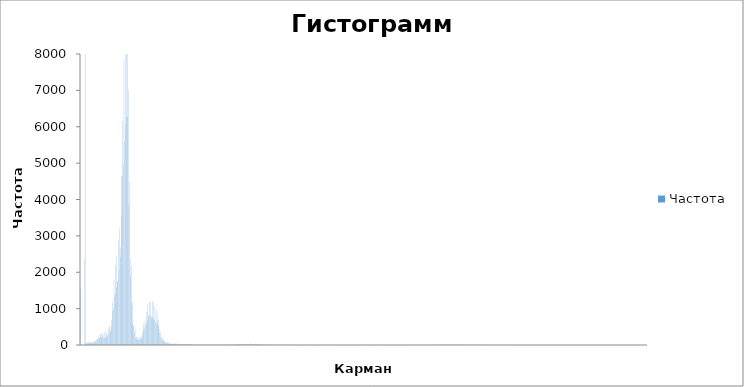
| Category | Частота |
|---|---|
| -1 | 1540 |
| -0,868263672 | 0 |
| -0,736527344 | 0 |
| -0,604791016 | 0 |
| -0,473054688 | 0 |
| -0,341318359 | 0 |
| -0,209582031 | 0 |
| -0,077845703 | 0 |
| 0,053890625 | 2382 |
| 0,185626953 | 45 |
| 0,317363281 | 24835 |
| 0,449099609 | 44 |
| 0,580835938 | 53 |
| 0,712572266 | 77 |
| 0,844308594 | 64 |
| 0,976044922 | 103 |
| 1,10778125 | 57 |
| 1,239517578 | 47 |
| 1,371253906 | 85 |
| 1,502990234 | 54 |
| 1,634726563 | 88 |
| 1,766462891 | 56 |
| 1,898199219 | 61 |
| 2,029935547 | 97 |
| 2,161671875 | 79 |
| 2,293408203 | 107 |
| 2,425144531 | 67 |
| 2,556880859 | 75 |
| 2,688617188 | 127 |
| 2,820353516 | 78 |
| 2,952089844 | 166 |
| 3,083826172 | 184 |
| 3,2155625 | 152 |
| 3,347298828 | 258 |
| 3,479035156 | 197 |
| 3,610771484 | 206 |
| 3,742507813 | 306 |
| 3,874244141 | 219 |
| 4,005980469 | 316 |
| 4,137716797 | 179 |
| 4,269453125 | 238 |
| 4,401189453 | 310 |
| 4,532925781 | 207 |
| 4,664662109 | 364 |
| 4,796398438 | 195 |
| 4,928134766 | 175 |
| 5,059871094 | 317 |
| 5,191607422 | 215 |
| 5,32334375 | 345 |
| 5,455080078 | 252 |
| 5,586816406 | 287 |
| 5,718552734 | 485 |
| 5,850289063 | 322 |
| 5,982025391 | 539 |
| 6,113761719 | 422 |
| 6,245498047 | 388 |
| 6,377234375 | 688 |
| 6,508970703 | 501 |
| 6,640707031 | 938 |
| 6,772443359 | 1184 |
| 6,904179688 | 1023 |
| 7,035916016 | 1782 |
| 7,167652344 | 1326 |
| 7,299388672 | 1412 |
| 7,431125 | 2191 |
| 7,562861328 | 1576 |
| 7,694597656 | 2431 |
| 7,826333984 | 1743 |
| 7,958070313 | 1744 |
| 8,089806641 | 2883 |
| 8,221542969 | 2039 |
| 8,353279297 | 3217 |
| 8,485015625 | 2420 |
| 8,616751953 | 2684 |
| 8,748488281 | 4652 |
| 8,880224609 | 3576 |
| 9,011960938 | 6165 |
| 9,143697266 | 4659 |
| 9,275433594 | 4966 |
| 9,407169922 | 7833 |
| 9,53890625 | 5611 |
| 9,670642578 | 8711 |
| 9,802378906 | 6092 |
| 9,934115234 | 6269 |
| 10,06585156 | 9246 |
| 10,19758789 | 6278 |
| 10,32932422 | 8709 |
| 10,46106055 | 7017 |
| 10,59279688 | 3856 |
| 10,7245332 | 4497 |
| 10,85626953 | 2375 |
| 10,98800586 | 1891 |
| 11,11974219 | 2172 |
| 11,25147852 | 1094 |
| 11,38321484 | 1196 |
| 11,51495117 | 611 |
| 11,6466875 | 495 |
| 11,77842383 | 557 |
| 11,91016016 | 339 |
| 12,04189648 | 416 |
| 12,17363281 | 204 |
| 12,30536914 | 152 |
| 12,43710547 | 240 |
| 12,5688418 | 148 |
| 12,70057813 | 223 |
| 12,83231445 | 149 |
| 12,96405078 | 149 |
| 13,09578711 | 218 |
| 13,22752344 | 176 |
| 13,35925977 | 237 |
| 13,49099609 | 162 |
| 13,62273242 | 206 |
| 13,75446875 | 354 |
| 13,88620508 | 270 |
| 14,01794141 | 409 |
| 14,14967773 | 600 |
| 14,28141406 | 457 |
| 14,41315039 | 700 |
| 14,54488672 | 540 |
| 14,67662305 | 595 |
| 14,80835938 | 929 |
| 14,9400957 | 674 |
| 15,07183203 | 1130 |
| 15,20356836 | 834 |
| 15,33530469 | 783 |
| 15,46704102 | 1176 |
| 15,59877734 | 805 |
| 15,73051367 | 1181 |
| 15,86225 | 751 |
| 15,99398633 | 806 |
| 16,12572266 | 1198 |
| 16,25745898 | 764 |
| 16,38919531 | 1192 |
| 16,52093164 | 705 |
| 16,65266797 | 694 |
| 16,7844043 | 1053 |
| 16,91614063 | 623 |
| 17,04787695 | 954 |
| 17,17961328 | 593 |
| 17,31134961 | 603 |
| 17,44308594 | 872 |
| 17,57482227 | 522 |
| 17,70655859 | 685 |
| 17,83829492 | 333 |
| 17,97003125 | 446 |
| 18,10176758 | 346 |
| 18,23350391 | 197 |
| 18,36524023 | 174 |
| 18,49697656 | 219 |
| 18,62871289 | 108 |
| 18,76044922 | 156 |
| 18,89218555 | 102 |
| 19,02392188 | 83 |
| 19,1556582 | 124 |
| 19,28739453 | 67 |
| 19,41913086 | 97 |
| 19,55086719 | 60 |
| 19,68260352 | 53 |
| 19,81433984 | 68 |
| 19,94607617 | 36 |
| 20,0778125 | 60 |
| 20,20954883 | 39 |
| 20,34128516 | 32 |
| 20,47302148 | 31 |
| 20,60475781 | 35 |
| 20,73649414 | 56 |
| 20,86823047 | 37 |
| 20,9999668 | 20 |
| 21,13170313 | 29 |
| 21,26343945 | 24 |
| 21,39517578 | 31 |
| 21,52691211 | 21 |
| 21,65864844 | 38 |
| 21,79038477 | 52 |
| 21,92212109 | 13 |
| 22,05385742 | 22 |
| 22,18559375 | 34 |
| 22,31733008 | 21 |
| 22,44906641 | 34 |
| 22,58080273 | 18 |
| 22,71253906 | 13 |
| 22,84427539 | 21 |
| 22,97601172 | 17 |
| 23,10774805 | 33 |
| 23,23948438 | 20 |
| 23,3712207 | 26 |
| 23,50295703 | 25 |
| 23,63469336 | 17 |
| 23,76642969 | 27 |
| 23,89816602 | 19 |
| 24,02990234 | 17 |
| 24,16163867 | 34 |
| 24,293375 | 22 |
| 24,42511133 | 34 |
| 24,55684766 | 13 |
| 24,68858398 | 22 |
| 24,82032031 | 28 |
| 24,95205664 | 21 |
| 25,08379297 | 30 |
| 25,2155293 | 22 |
| 25,34726563 | 29 |
| 25,47900195 | 20 |
| 25,61073828 | 11 |
| 25,74247461 | 10 |
| 25,87421094 | 13 |
| 26,00594727 | 17 |
| 26,13768359 | 14 |
| 26,26941992 | 10 |
| 26,40115625 | 6 |
| 26,53289258 | 16 |
| 26,66462891 | 11 |
| 26,79636523 | 11 |
| 26,92810156 | 3 |
| 27,05983789 | 10 |
| 27,19157422 | 7 |
| 27,32331055 | 8 |
| 27,45504688 | 17 |
| 27,5867832 | 6 |
| 27,71851953 | 8 |
| 27,85025586 | 15 |
| 27,98199219 | 16 |
| 28,11372852 | 8 |
| 28,24546484 | 3 |
| 28,37720117 | 7 |
| 28,5089375 | 14 |
| 28,64067383 | 7 |
| 28,77241016 | 5 |
| 28,90414648 | 5 |
| 29,03588281 | 7 |
| 29,16761914 | 6 |
| 29,29935547 | 12 |
| 29,4310918 | 6 |
| 29,56282813 | 9 |
| 29,69456445 | 6 |
| 29,82630078 | 17 |
| 29,95803711 | 7 |
| 30,08977344 | 13 |
| 30,22150977 | 12 |
| 30,35324609 | 14 |
| 30,48498242 | 14 |
| 30,61671875 | 10 |
| 30,74845508 | 5 |
| 30,88019141 | 10 |
| 31,01192773 | 7 |
| 31,14366406 | 12 |
| 31,27540039 | 4 |
| 31,40713672 | 4 |
| 31,53887305 | 17 |
| 31,67060938 | 9 |
| 31,8023457 | 13 |
| 31,93408203 | 13 |
| 32,06581836 | 5 |
| 32,19755469 | 9 |
| 32,32929102 | 6 |
| 32,46102734 | 14 |
| 32,59276367 | 7 |
| 32,7245 | 5 |
| 32,85623633 | 20 |
| 32,98797266 | 12 |
| 33,11970898 | 9 |
| 33,25144531 | 14 |
| 33,38318164 | 8 |
| 33,51491797 | 10 |
| 33,6466543 | 11 |
| 33,77839063 | 7 |
| 33,91012695 | 17 |
| 34,04186328 | 7 |
| 34,17359961 | 14 |
| 34,30533594 | 5 |
| 34,43707227 | 12 |
| 34,56880859 | 16 |
| 34,70054492 | 12 |
| 34,83228125 | 17 |
| 34,96401758 | 16 |
| 35,09575391 | 11 |
| 35,22749023 | 6 |
| 35,35922656 | 10 |
| 35,49096289 | 24 |
| 35,62269922 | 12 |
| 35,75443555 | 12 |
| 35,88617188 | 32 |
| 36,0179082 | 12 |
| 36,14964453 | 24 |
| 36,28138086 | 21 |
| 36,41311719 | 28 |
| 36,54485352 | 27 |
| 36,67658984 | 31 |
| 36,80832617 | 21 |
| 36,9400625 | 28 |
| 37,07179883 | 17 |
| 37,20353516 | 24 |
| 37,33527148 | 23 |
| 37,46700781 | 32 |
| 37,59874414 | 35 |
| 37,73048047 | 27 |
| 37,8622168 | 29 |
| 37,99395313 | 20 |
| 38,12568945 | 17 |
| 38,25742578 | 31 |
| 38,38916211 | 12 |
| 38,52089844 | 26 |
| 38,65263477 | 22 |
| 38,78437109 | 12 |
| 38,91610742 | 40 |
| 39,04784375 | 19 |
| 39,17958008 | 25 |
| 39,31131641 | 28 |
| 39,44305273 | 21 |
| 39,57478906 | 46 |
| 39,70652539 | 19 |
| 39,83826172 | 21 |
| 39,96999805 | 26 |
| 40,10173438 | 7 |
| 40,2334707 | 29 |
| 40,36520703 | 27 |
| 40,49694336 | 18 |
| 40,62867969 | 41 |
| 40,76041602 | 9 |
| 40,89215234 | 25 |
| 41,02388867 | 11 |
| 41,155625 | 23 |
| 41,28736133 | 26 |
| 41,41909766 | 16 |
| 41,55083398 | 27 |
| 41,68257031 | 21 |
| 41,81430664 | 16 |
| 41,94604297 | 24 |
| 42,0777793 | 13 |
| 42,20951563 | 24 |
| 42,34125195 | 14 |
| 42,47298828 | 11 |
| 42,60472461 | 19 |
| 42,73646094 | 8 |
| 42,86819727 | 14 |
| 42,99993359 | 7 |
| 43,13166992 | 17 |
| 43,26340625 | 2 |
| 43,39514258 | 6 |
| 43,52687891 | 4 |
| 43,65861523 | 10 |
| 43,79035156 | 3 |
| 43,92208789 | 13 |
| 44,05382422 | 7 |
| 44,18556055 | 9 |
| 44,31729688 | 5 |
| 44,4490332 | 5 |
| 44,58076953 | 10 |
| 44,71250586 | 5 |
| 44,84424219 | 6 |
| 44,97597852 | 17 |
| 45,10771484 | 6 |
| 45,23945117 | 6 |
| 45,3711875 | 7 |
| 45,50292383 | 2 |
| 45,63466016 | 4 |
| 45,76639648 | 0 |
| 45,89813281 | 3 |
| 46,02986914 | 4 |
| 46,16160547 | 5 |
| 46,2933418 | 1 |
| 46,42507813 | 5 |
| 46,55681445 | 1 |
| 46,68855078 | 9 |
| 46,82028711 | 3 |
| 46,95202344 | 5 |
| 47,08375977 | 2 |
| 47,21549609 | 6 |
| 47,34723242 | 10 |
| 47,47896875 | 4 |
| 47,61070508 | 8 |
| 47,74244141 | 9 |
| 47,87417773 | 6 |
| 48,00591406 | 5 |
| 48,13765039 | 5 |
| 48,26938672 | 5 |
| 48,40112305 | 2 |
| 48,53285938 | 1 |
| 48,6645957 | 1 |
| 48,79633203 | 6 |
| 48,92806836 | 8 |
| 49,05980469 | 3 |
| 49,19154102 | 3 |
| 49,32327734 | 4 |
| 49,45501367 | 4 |
| 49,58675 | 1 |
| 49,71848633 | 2 |
| 49,85022266 | 0 |
| 49,98195898 | 2 |
| 50,11369531 | 0 |
| 50,24543164 | 1 |
| 50,37716797 | 1 |
| 50,5089043 | 0 |
| 50,64064063 | 3 |
| 50,77237695 | 1 |
| 50,90411328 | 2 |
| 51,03584961 | 2 |
| 51,16758594 | 3 |
| 51,29932227 | 1 |
| 51,43105859 | 3 |
| 51,56279492 | 1 |
| 51,69453125 | 1 |
| 51,82626758 | 1 |
| 51,95800391 | 2 |
| 52,08974023 | 2 |
| 52,22147656 | 0 |
| 52,35321289 | 6 |
| 52,48494922 | 2 |
| 52,61668555 | 3 |
| 52,74842188 | 0 |
| 52,8801582 | 0 |
| 53,01189453 | 2 |
| 53,14363086 | 0 |
| 53,27536719 | 1 |
| 53,40710352 | 3 |
| 53,53883984 | 1 |
| 53,67057617 | 5 |
| 53,8023125 | 1 |
| 53,93404883 | 5 |
| 54,06578516 | 1 |
| 54,19752148 | 1 |
| 54,32925781 | 1 |
| 54,46099414 | 1 |
| 54,59273047 | 0 |
| 54,7244668 | 0 |
| 54,85620313 | 3 |
| 54,98793945 | 5 |
| 55,11967578 | 1 |
| 55,25141211 | 1 |
| 55,38314844 | 1 |
| 55,51488477 | 1 |
| 55,64662109 | 1 |
| 55,77835742 | 0 |
| 55,91009375 | 1 |
| 56,04183008 | 3 |
| 56,17356641 | 1 |
| 56,30530273 | 0 |
| 56,43703906 | 3 |
| 56,56877539 | 4 |
| 56,70051172 | 4 |
| 56,83224805 | 1 |
| 56,96398438 | 1 |
| 57,0957207 | 2 |
| 57,22745703 | 2 |
| 57,35919336 | 1 |
| 57,49092969 | 1 |
| 57,62266602 | 1 |
| 57,75440234 | 1 |
| 57,88613867 | 3 |
| 58,017875 | 5 |
| 58,14961133 | 1 |
| 58,28134766 | 2 |
| 58,41308398 | 2 |
| 58,54482031 | 1 |
| 58,67655664 | 2 |
| 58,80829297 | 0 |
| 58,9400293 | 5 |
| 59,07176563 | 1 |
| 59,20350195 | 0 |
| 59,33523828 | 1 |
| 59,46697461 | 2 |
| 59,59871094 | 0 |
| 59,73044727 | 0 |
| 59,86218359 | 0 |
| 59,99391992 | 0 |
| 60,12565625 | 1 |
| 60,25739258 | 1 |
| 60,38912891 | 3 |
| 60,52086523 | 1 |
| 60,65260156 | 0 |
| 60,78433789 | 0 |
| 60,91607422 | 0 |
| 61,04781055 | 1 |
| 61,17954688 | 3 |
| 61,3112832 | 0 |
| 61,44301953 | 0 |
| 61,57475586 | 0 |
| 61,70649219 | 3 |
| 61,83822852 | 0 |
| 61,96996484 | 1 |
| 62,10170117 | 0 |
| 62,2334375 | 1 |
| 62,36517383 | 1 |
| 62,49691016 | 0 |
| 62,62864648 | 1 |
| 62,76038281 | 0 |
| 62,89211914 | 4 |
| 63,02385547 | 3 |
| 63,1555918 | 2 |
| 63,28732813 | 3 |
| 63,41906445 | 1 |
| 63,55080078 | 2 |
| 63,68253711 | 1 |
| 63,81427344 | 0 |
| 63,94600977 | 0 |
| 64,07774609 | 0 |
| 64,20948242 | 1 |
| 64,34121875 | 1 |
| 64,47295508 | 0 |
| 64,60469141 | 1 |
| 64,73642773 | 0 |
| 64,86816406 | 0 |
| 64,99990039 | 3 |
| 65,13163672 | 1 |
| 65,26337305 | 1 |
| 65,39510938 | 0 |
| 65,5268457 | 0 |
| 65,65858203 | 2 |
| 65,79031836 | 2 |
| 65,92205469 | 1 |
| 66,05379102 | 0 |
| 66,18552734 | 0 |
| 66,31726367 | 2 |
| 66,449 | 1 |
| 66,58073633 | 3 |
| 66,71247266 | 3 |
| 66,84420898 | 0 |
| 66,97594531 | 7 |
| 67,10768164 | 2 |
| 67,23941797 | 3 |
| 67,3711543 | 3 |
| 67,50289063 | 3 |
| 67,63462695 | 2 |
| 67,76636328 | 6 |
| 67,89809961 | 3 |
| 68,02983594 | 1 |
| 68,16157227 | 1 |
| 68,29330859 | 0 |
| 68,42504492 | 3 |
| 68,55678125 | 2 |
| 68,68851758 | 0 |
| 68,82025391 | 2 |
| 68,95199023 | 1 |
| 69,08372656 | 3 |
| 69,21546289 | 0 |
| 69,34719922 | 3 |
| 69,47893555 | 0 |
| 69,61067188 | 0 |
| 69,7424082 | 0 |
| 69,87414453 | 0 |
| 70,00588086 | 1 |
| 70,13761719 | 1 |
| 70,26935352 | 3 |
| 70,40108984 | 4 |
| 70,53282617 | 0 |
| 70,6645625 | 1 |
| 70,79629883 | 0 |
| 70,92803516 | 1 |
| 71,05977148 | 0 |
| 71,19150781 | 1 |
| 71,32324414 | 3 |
| 71,45498047 | 0 |
| 71,5867168 | 2 |
| 71,71845313 | 2 |
| 71,85018945 | 1 |
| 71,98192578 | 3 |
| 72,11366211 | 0 |
| 72,24539844 | 0 |
| 72,37713477 | 2 |
| 72,50887109 | 0 |
| 72,64060742 | 2 |
| 72,77234375 | 6 |
| 72,90408008 | 0 |
| 73,03581641 | 1 |
| 73,16755273 | 1 |
| 73,29928906 | 2 |
| 73,43102539 | 1 |
| 73,56276172 | 2 |
| 73,69449805 | 3 |
| 73,82623438 | 1 |
| 73,9579707 | 1 |
| 74,08970703 | 5 |
| 74,22144336 | 0 |
| 74,35317969 | 1 |
| 74,48491602 | 2 |
| 74,61665234 | 1 |
| 74,74838867 | 2 |
| 74,880125 | 1 |
| 75,01186133 | 0 |
| 75,14359766 | 1 |
| 75,27533398 | 2 |
| 75,40707031 | 0 |
| 75,53880664 | 0 |
| 75,67054297 | 0 |
| 75,8022793 | 0 |
| 75,93401563 | 3 |
| 76,06575195 | 3 |
| 76,19748828 | 3 |
| 76,32922461 | 1 |
| 76,46096094 | 2 |
| 76,59269727 | 3 |
| 76,72443359 | 4 |
| 76,85616992 | 1 |
| 76,98790625 | 3 |
| 77,11964258 | 3 |
| 77,25137891 | 3 |
| 77,38311523 | 4 |
| 77,51485156 | 1 |
| 77,64658789 | 6 |
| 77,77832422 | 7 |
| 77,91006055 | 3 |
| 78,04179688 | 1 |
| 78,1735332 | 6 |
| 78,30526953 | 2 |
| 78,43700586 | 6 |
| 78,56874219 | 5 |
| 78,70047852 | 1 |
| 78,83221484 | 5 |
| 78,96395117 | 0 |
| 79,0956875 | 1 |
| 79,22742383 | 6 |
| 79,35916016 | 0 |
| 79,49089648 | 7 |
| 79,62263281 | 5 |
| 79,75436914 | 3 |
| 79,88610547 | 3 |
| 80,0178418 | 7 |
| 80,14957813 | 5 |
| 80,28131445 | 3 |
| 80,41305078 | 0 |
| 80,54478711 | 5 |
| 80,67652344 | 1 |
| 80,80825977 | 5 |
| 80,93999609 | 3 |
| 81,07173242 | 3 |
| 81,20346875 | 3 |
| 81,33520508 | 3 |
| 81,46694141 | 3 |
| 81,59867773 | 6 |
| 81,73041406 | 4 |
| 81,86215039 | 0 |
| 81,99388672 | 2 |
| 82,12562305 | 2 |
| 82,25735938 | 1 |
| 82,3890957 | 2 |
| 82,52083203 | 11 |
| 82,65256836 | 5 |
| 82,78430469 | 4 |
| 82,91604102 | 0 |
| 83,04777734 | 4 |
| 83,17951367 | 8 |
| 83,31125 | 4 |
| 83,44298633 | 6 |
| 83,57472266 | 5 |
| 83,70645898 | 3 |
| 83,83819531 | 3 |
| 83,96993164 | 5 |
| 84,10166797 | 9 |
| 84,2334043 | 9 |
| 84,36514063 | 4 |
| 84,49687695 | 5 |
| 84,62861328 | 1 |
| 84,76034961 | 8 |
| 84,89208594 | 4 |
| 85,02382227 | 5 |
| 85,15555859 | 7 |
| 85,28729492 | 11 |
| 85,41903125 | 4 |
| 85,55076758 | 4 |
| 85,68250391 | 5 |
| 85,81424023 | 7 |
| 85,94597656 | 2 |
| 86,07771289 | 5 |
| 86,20944922 | 6 |
| 86,34118555 | 4 |
| 86,47292188 | 10 |
| 86,6046582 | 9 |
| 86,73639453 | 10 |
| 86,86813086 | 7 |
| 86,99986719 | 5 |
| 87,13160352 | 9 |
| 87,26333984 | 8 |
| 87,39507617 | 7 |
| 87,5268125 | 6 |
| 87,65854883 | 3 |
| 87,79028516 | 9 |
| 87,92202148 | 4 |
| 88,05375781 | 5 |
| 88,18549414 | 9 |
| 88,31723047 | 12 |
| 88,4489668 | 8 |
| 88,58070313 | 2 |
| 88,71243945 | 8 |
| 88,84417578 | 7 |
| 88,97591211 | 11 |
| 89,10764844 | 3 |
| 89,23938477 | 6 |
| 89,37112109 | 5 |
| 89,50285742 | 7 |
| 89,63459375 | 10 |
| 89,76633008 | 7 |
| 89,89806641 | 12 |
| 90,02980273 | 3 |
| 90,16153906 | 8 |
| 90,29327539 | 9 |
| 90,42501172 | 6 |
| 90,55674805 | 4 |
| 90,68848438 | 7 |
| 90,8202207 | 11 |
| 90,95195703 | 1 |
| 91,08369336 | 3 |
| 91,21542969 | 16 |
| 91,34716602 | 4 |
| 91,47890234 | 8 |
| 91,61063867 | 3 |
| 91,742375 | 3 |
| 91,87411133 | 2 |
| 92,00584766 | 3 |
| 92,13758398 | 9 |
| 92,26932031 | 6 |
| 92,40105664 | 3 |
| 92,53279297 | 11 |
| 92,6645293 | 3 |
| 92,79626563 | 8 |
| 92,92800195 | 4 |
| 93,05973828 | 2 |
| 93,19147461 | 4 |
| 93,32321094 | 6 |
| 93,45494727 | 2 |
| 93,58668359 | 4 |
| 93,71841992 | 6 |
| 93,85015625 | 1 |
| 93,98189258 | 1 |
| 94,11362891 | 4 |
| 94,24536523 | 5 |
| 94,37710156 | 0 |
| 94,50883789 | 2 |
| 94,64057422 | 1 |
| 94,77231055 | 3 |
| 94,90404688 | 6 |
| 95,0357832 | 4 |
| 95,16751953 | 3 |
| 95,29925586 | 5 |
| 95,43099219 | 2 |
| 95,56272852 | 1 |
| 95,69446484 | 0 |
| 95,82620117 | 1 |
| 95,9579375 | 2 |
| 96,08967383 | 0 |
| 96,22141016 | 0 |
| 96,35314648 | 0 |
| 96,48488281 | 1 |
| 96,61661914 | 3 |
| 96,74835547 | 5 |
| 96,8800918 | 2 |
| 97,01182813 | 2 |
| 97,14356445 | 0 |
| 97,27530078 | 1 |
| 97,40703711 | 5 |
| 97,53877344 | 7 |
| 97,67050977 | 0 |
| 97,80224609 | 0 |
| 97,93398242 | 3 |
| 98,06571875 | 5 |
| 98,19745508 | 0 |
| 98,32919141 | 1 |
| 98,46092773 | 1 |
| 98,59266406 | 1 |
| 98,72440039 | 0 |
| 98,85613672 | 3 |
| 98,98787305 | 2 |
| 99,11960938 | 0 |
| 99,2513457 | 5 |
| 99,38308203 | 2 |
| 99,51481836 | 0 |
| 99,64655469 | 0 |
| 99,77829102 | 2 |
| 99,91002734 | 0 |
| 100,0417637 | 0 |
| 100,1735 | 1 |
| 100,3052363 | 5 |
| 100,4369727 | 0 |
| 100,568709 | 1 |
| 100,7004453 | 0 |
| 100,8321816 | 2 |
| 100,963918 | 3 |
| 101,0956543 | 0 |
| 101,2273906 | 2 |
| 101,359127 | 1 |
| 101,4908633 | 0 |
| 101,6225996 | 0 |
| 101,7543359 | 5 |
| 101,8860723 | 3 |
| 102,0178086 | 0 |
| 102,1495449 | 3 |
| 102,2812813 | 1 |
| 102,4130176 | 1 |
| 102,5447539 | 0 |
| 102,6764902 | 0 |
| 102,8082266 | 0 |
| 102,9399629 | 1 |
| 103,0716992 | 0 |
| 103,2034355 | 2 |
| 103,3351719 | 1 |
| 103,4669082 | 2 |
| 103,5986445 | 0 |
| 103,7303809 | 1 |
| 103,8621172 | 1 |
| 103,9938535 | 4 |
| 104,1255898 | 1 |
| 104,2573262 | 1 |
| 104,3890625 | 0 |
| 104,5207988 | 2 |
| 104,6525352 | 0 |
| 104,7842715 | 0 |
| 104,9160078 | 0 |
| 105,0477441 | 0 |
| 105,1794805 | 2 |
| 105,3112168 | 1 |
| 105,4429531 | 0 |
| 105,5746895 | 0 |
| 105,7064258 | 0 |
| 105,8381621 | 1 |
| 105,9698984 | 1 |
| 106,1016348 | 0 |
| 106,2333711 | 1 |
| 106,3651074 | 1 |
| 106,4968438 | 0 |
| 106,6285801 | 0 |
| 106,7603164 | 0 |
| 106,8920527 | 1 |
| 107,0237891 | 2 |
| 107,1555254 | 1 |
| 107,2872617 | 0 |
| 107,418998 | 0 |
| 107,5507344 | 2 |
| 107,6824707 | 0 |
| 107,814207 | 0 |
| 107,9459434 | 0 |
| 108,0776797 | 1 |
| 108,209416 | 0 |
| 108,3411523 | 0 |
| 108,4728887 | 1 |
| 108,604625 | 0 |
| 108,7363613 | 2 |
| 108,8680977 | 0 |
| 108,999834 | 0 |
| 109,1315703 | 0 |
| 109,2633066 | 0 |
| 109,395043 | 1 |
| 109,5267793 | 0 |
| 109,6585156 | 0 |
| 109,790252 | 0 |
| 109,9219883 | 0 |
| 110,0537246 | 0 |
| 110,1854609 | 0 |
| 110,3171973 | 0 |
| 110,4489336 | 1 |
| 110,5806699 | 2 |
| 110,7124063 | 0 |
| 110,8441426 | 0 |
| 110,9758789 | 0 |
| 111,1076152 | 0 |
| 111,2393516 | 0 |
| 111,3710879 | 1 |
| 111,5028242 | 0 |
| 111,6345605 | 1 |
| 111,7662969 | 3 |
| 111,8980332 | 0 |
| 112,0297695 | 3 |
| 112,1615059 | 0 |
| 112,2932422 | 0 |
| 112,4249785 | 1 |
| 112,5567148 | 0 |
| 112,6884512 | 2 |
| 112,8201875 | 0 |
| 112,9519238 | 0 |
| 113,0836602 | 0 |
| 113,2153965 | 0 |
| 113,3471328 | 0 |
| 113,4788691 | 1 |
| 113,6106055 | 0 |
| 113,7423418 | 0 |
| 113,8740781 | 0 |
| 114,0058145 | 0 |
| 114,1375508 | 1 |
| 114,2692871 | 0 |
| 114,4010234 | 1 |
| 114,5327598 | 0 |
| 114,6644961 | 0 |
| 114,7962324 | 0 |
| 114,9279688 | 2 |
| 115,0597051 | 0 |
| 115,1914414 | 0 |
| 115,3231777 | 1 |
| 115,4549141 | 1 |
| 115,5866504 | 1 |
| 115,7183867 | 2 |
| 115,850123 | 0 |
| 115,9818594 | 0 |
| 116,1135957 | 1 |
| 116,245332 | 0 |
| 116,3770684 | 0 |
| 116,5088047 | 0 |
| 116,640541 | 0 |
| 116,7722773 | 1 |
| 116,9040137 | 0 |
| 117,03575 | 2 |
| 117,1674863 | 0 |
| 117,2992227 | 0 |
| 117,430959 | 0 |
| 117,5626953 | 0 |
| 117,6944316 | 0 |
| 117,826168 | 0 |
| 117,9579043 | 0 |
| 118,0896406 | 0 |
| 118,221377 | 1 |
| 118,3531133 | 0 |
| 118,4848496 | 0 |
| 118,6165859 | 0 |
| 118,7483223 | 1 |
| 118,8800586 | 0 |
| 119,0117949 | 0 |
| 119,1435313 | 0 |
| 119,2752676 | 0 |
| 119,4070039 | 0 |
| 119,5387402 | 0 |
| 119,6704766 | 0 |
| 119,8022129 | 0 |
| 119,9339492 | 0 |
| 120,0656855 | 0 |
| 120,1974219 | 0 |
| 120,3291582 | 0 |
| 120,4608945 | 0 |
| 120,5926309 | 0 |
| 120,7243672 | 0 |
| 120,8561035 | 0 |
| 120,9878398 | 0 |
| 121,1195762 | 0 |
| 121,2513125 | 0 |
| 121,3830488 | 0 |
| 121,5147852 | 0 |
| 121,6465215 | 0 |
| 121,7782578 | 1 |
| 121,9099941 | 0 |
| 122,0417305 | 0 |
| 122,1734668 | 0 |
| 122,3052031 | 1 |
| 122,4369395 | 0 |
| 122,5686758 | 0 |
| 122,7004121 | 0 |
| 122,8321484 | 0 |
| 122,9638848 | 0 |
| 123,0956211 | 0 |
| 123,2273574 | 0 |
| 123,3590938 | 0 |
| 123,4908301 | 0 |
| 123,6225664 | 1 |
| 123,7543027 | 1 |
| 123,8860391 | 0 |
| 124,0177754 | 0 |
| 124,1495117 | 0 |
| 124,281248 | 0 |
| 124,4129844 | 0 |
| 124,5447207 | 0 |
| 124,676457 | 0 |
| 124,8081934 | 0 |
| 124,9399297 | 0 |
| 125,071666 | 0 |
| 125,2034023 | 0 |
| 125,3351387 | 0 |
| 125,466875 | 1 |
| 125,5986113 | 0 |
| 125,7303477 | 2 |
| 125,862084 | 1 |
| 125,9938203 | 0 |
| 126,1255566 | 0 |
| 126,257293 | 1 |
| 126,3890293 | 1 |
| 126,5207656 | 1 |
| 126,652502 | 0 |
| 126,7842383 | 0 |
| 126,9159746 | 0 |
| 127,0477109 | 1 |
| 127,1794473 | 0 |
| 127,3111836 | 0 |
| 127,4429199 | 0 |
| 127,5746563 | 0 |
| 127,7063926 | 0 |
| 127,8381289 | 0 |
| 127,9698652 | 0 |
| 128,1016016 | 0 |
| 128,2333379 | 0 |
| 128,3650742 | 0 |
| 128,4968105 | 0 |
| 128,6285469 | 0 |
| 128,7602832 | 2 |
| 128,8920195 | 0 |
| 129,0237559 | 0 |
| 129,1554922 | 0 |
| 129,2872285 | 0 |
| 129,4189648 | 0 |
| 129,5507012 | 0 |
| 129,6824375 | 0 |
| 129,8141738 | 0 |
| 129,9459102 | 0 |
| 130,0776465 | 0 |
| 130,2093828 | 0 |
| 130,3411191 | 0 |
| 130,4728555 | 0 |
| 130,6045918 | 0 |
| 130,7363281 | 0 |
| 130,8680645 | 0 |
| 130,9998008 | 1 |
| 131,1315371 | 0 |
| 131,2632734 | 0 |
| 131,3950098 | 2 |
| 131,5267461 | 0 |
| 131,6584824 | 0 |
| 131,7902188 | 0 |
| 131,9219551 | 0 |
| 132,0536914 | 0 |
| 132,1854277 | 0 |
| 132,3171641 | 0 |
| 132,4489004 | 0 |
| 132,5806367 | 0 |
| 132,712373 | 0 |
| 132,8441094 | 0 |
| 132,9758457 | 0 |
| 133,107582 | 0 |
| 133,2393184 | 0 |
| 133,3710547 | 1 |
| 133,502791 | 0 |
| 133,6345273 | 0 |
| 133,7662637 | 0 |
| Еще | 1 |